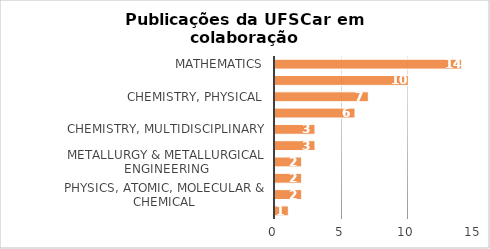
| Category | # Records |
|---|---|
| mathematics | 14 |
| materials science, multidisciplinary | 10 |
| chemistry, physical | 7 |
| nanoscience & nanotechnology | 6 |
| chemistry, multidisciplinary | 3 |
| physics, condensed matter | 3 |
| metallurgy & metallurgical engineering | 2 |
| physics, applied | 2 |
| physics, atomic, molecular & chemical | 2 |
| biochemical research methods | 1 |